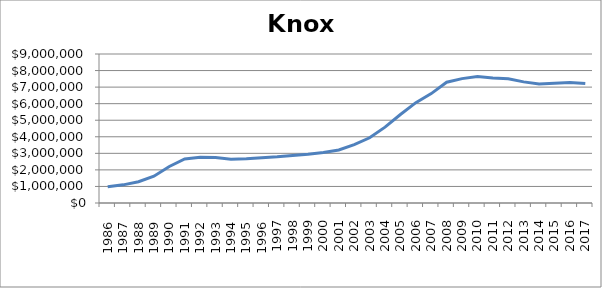
| Category | Knox (000s) |
|---|---|
|       1986 | 979600 |
|       1987 | 1095800 |
|       1988 | 1287450 |
|       1989 | 1615500 |
|       1990 | 2203350 |
|       1991 | 2659150 |
|       1992 | 2768600 |
|       1993 | 2750700 |
|       1994 | 2640300 |
|       1995 | 2672200 |
|       1996 | 2729375.9 |
| 1997 | 2790650 |
| 1998 | 2874900 |
| 1999 | 2948600 |
| 2000 | 3048750 |
| 2001 | 3204000 |
| 2002 | 3528600 |
| 2003 | 3938050 |
| 2004 | 4582000 |
| 2005 | 5347200 |
| 2006 | 6062650 |
| 2007 | 6607900 |
| 2008 | 7294800 |
| 2009 | 7512100 |
| 2010 | 7633800 |
| 2011 | 7544200 |
| 2012 | 7509650 |
| 2013 | 7317100 |
| 2014 | 7181900 |
| 2015 | 7227250 |
| 2016 | 7283700 |
| 2017 | 7219800 |